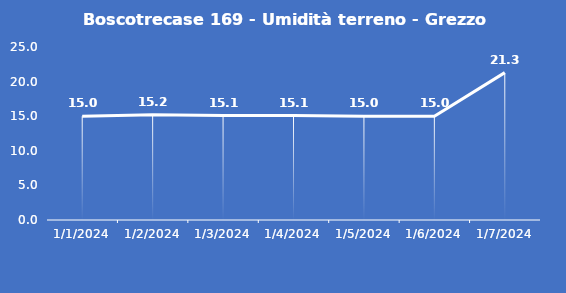
| Category | Boscotrecase 169 - Umidità terreno - Grezzo (%VWC) |
|---|---|
| 1/1/24 | 15 |
| 1/2/24 | 15.2 |
| 1/3/24 | 15.1 |
| 1/4/24 | 15.1 |
| 1/5/24 | 15 |
| 1/6/24 | 15 |
| 1/7/24 | 21.3 |